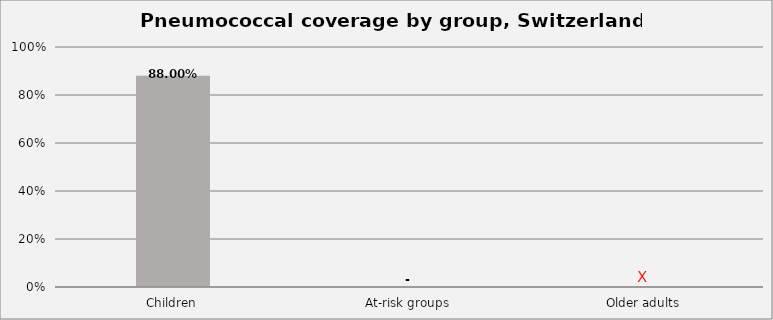
| Category | Series 0 |
|---|---|
| Children | 0.88 |
| At-risk groups | 0 |
| Older adults | 0 |